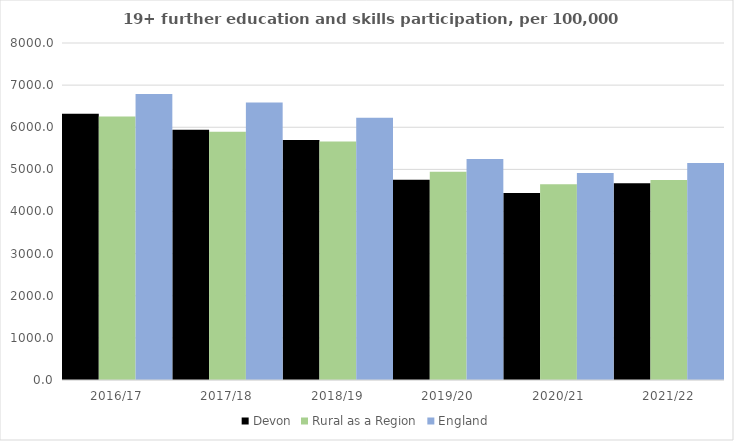
| Category | Devon | Rural as a Region | England |
|---|---|---|---|
| 2016/17 | 6318.255 | 6253.401 | 6788 |
| 2017/18 | 5943.247 | 5892.029 | 6588 |
| 2018/19 | 5695.014 | 5661.873 | 6227 |
| 2019/20 | 4754.775 | 4943.801 | 5244 |
| 2020/21 | 4439.148 | 4646.727 | 4913 |
| 2021/22 | 4670.18 | 4747.049 | 5151 |